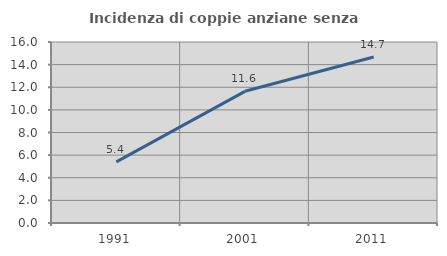
| Category | Incidenza di coppie anziane senza figli  |
|---|---|
| 1991.0 | 5.405 |
| 2001.0 | 11.64 |
| 2011.0 | 14.674 |